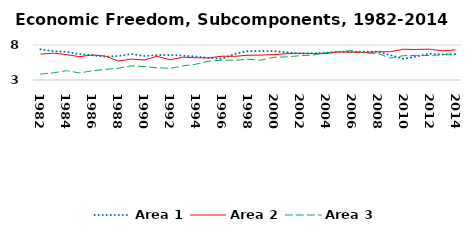
| Category | Area 1 | Area 2 | Area 3 |
|---|---|---|---|
| 1982.0 | 7.381 | 6.697 | 3.849 |
| 1983.0 | 7.131 | 6.834 | 4.028 |
| 1984.0 | 7.023 | 6.631 | 4.327 |
| 1985.0 | 6.689 | 6.337 | 4.018 |
| 1986.0 | 6.539 | 6.569 | 4.309 |
| 1987.0 | 6.317 | 6.423 | 4.517 |
| 1988.0 | 6.436 | 5.7 | 4.682 |
| 1989.0 | 6.697 | 5.989 | 5.021 |
| 1990.0 | 6.433 | 5.867 | 4.93 |
| 1991.0 | 6.567 | 6.383 | 4.758 |
| 1992.0 | 6.568 | 5.885 | 4.662 |
| 1993.0 | 6.494 | 6.267 | 5.007 |
| 1994.0 | 6.345 | 6.165 | 5.265 |
| 1995.0 | 6.137 | 6.168 | 5.698 |
| 1996.0 | 6.032 | 6.399 | 5.853 |
| 1997.0 | 6.741 | 6.385 | 5.825 |
| 1998.0 | 7.124 | 6.536 | 5.966 |
| 1999.0 | 7.152 | 6.558 | 5.846 |
| 2000.0 | 7.114 | 6.628 | 6.239 |
| 2001.0 | 6.946 | 6.762 | 6.309 |
| 2002.0 | 6.779 | 6.815 | 6.471 |
| 2003.0 | 6.829 | 6.776 | 6.552 |
| 2004.0 | 6.878 | 6.769 | 6.901 |
| 2005.0 | 7.025 | 7.013 | 7.067 |
| 2006.0 | 7.042 | 6.96 | 7.2 |
| 2007.0 | 7.059 | 6.927 | 6.855 |
| 2008.0 | 7.035 | 7.038 | 6.778 |
| 2009.0 | 6.542 | 7.055 | 6.136 |
| 2010.0 | 6.025 | 7.387 | 6.473 |
| 2011.0 | 6.372 | 7.359 | 6.512 |
| 2012.0 | 6.743 | 7.406 | 6.495 |
| 2013.0 | 6.641 | 7.17 | 6.619 |
| 2014.0 | 6.69 | 7.319 | 6.717 |